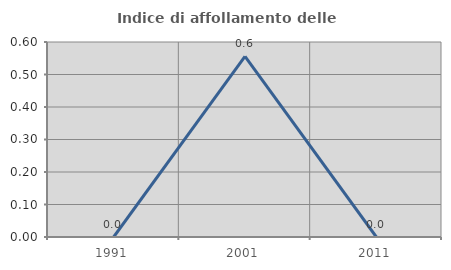
| Category | Indice di affollamento delle abitazioni  |
|---|---|
| 1991.0 | 0 |
| 2001.0 | 0.556 |
| 2011.0 | 0 |